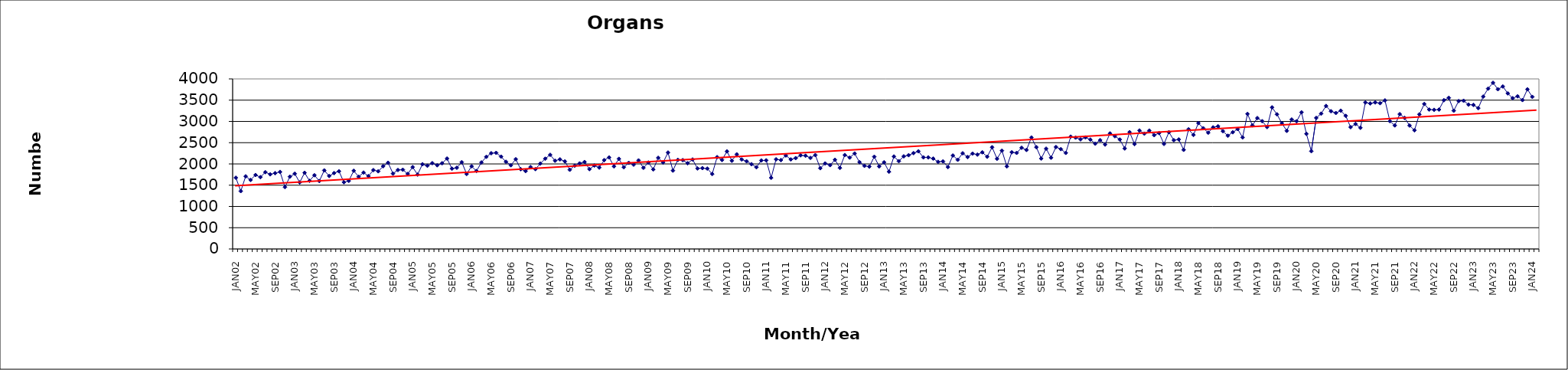
| Category | Series 0 |
|---|---|
| JAN02 | 1675 |
| FEB02 | 1360 |
| MAR02 | 1708 |
| APR02 | 1624 |
| MAY02 | 1740 |
| JUN02 | 1689 |
| JUL02 | 1806 |
| AUG02 | 1755 |
| SEP02 | 1783 |
| OCT02 | 1813 |
| NOV02 | 1455 |
| DEC02 | 1701 |
| JAN03 | 1770 |
| FEB03 | 1565 |
| MAR03 | 1792 |
| APR03 | 1603 |
| MAY03 | 1734 |
| JUN03 | 1598 |
| JUL03 | 1848 |
| AUG03 | 1716 |
| SEP03 | 1785 |
| OCT03 | 1827 |
| NOV03 | 1570 |
| DEC03 | 1602 |
| JAN04 | 1839 |
| FEB04 | 1700 |
| MAR04 | 1797 |
| APR04 | 1715 |
| MAY04 | 1855 |
| JUN04 | 1827 |
| JUL04 | 1946 |
| AUG04 | 2028 |
| SEP04 | 1773 |
| OCT04 | 1857 |
| NOV04 | 1864 |
| DEC04 | 1766 |
| JAN05 | 1925 |
| FEB05 | 1750 |
| MAR05 | 1993 |
| APR05 | 1958 |
| MAY05 | 2018 |
| JUN05 | 1969 |
| JUL05 | 2016 |
| AUG05 | 2127 |
| SEP05 | 1888 |
| OCT05 | 1910 |
| NOV05 | 2042 |
| DEC05 | 1764 |
| JAN06 | 1945 |
| FEB06 | 1834 |
| MAR06 | 2035 |
| APR06 | 2167 |
| MAY06 | 2252 |
| JUN06 | 2261 |
| JUL06 | 2172 |
| AUG06 | 2051 |
| SEP06 | 1969 |
| OCT06 | 2111 |
| NOV06 | 1876 |
| DEC06 | 1832 |
| JAN07 | 1927 |
| FEB07 | 1878 |
| MAR07 | 2009 |
| APR07 | 2122 |
| MAY07 | 2214 |
| JUN07 | 2076 |
| JUL07 | 2108 |
| AUG07 | 2060 |
| SEP07 | 1863 |
| OCT07 | 1959 |
| NOV07 | 2012 |
| DEC07 | 2046 |
| JAN08 | 1878 |
| FEB08 | 1962 |
| MAR08 | 1914 |
| APR08 | 2089 |
| MAY08 | 2153 |
| JUN08 | 1942 |
| JUL08 | 2120 |
| AUG08 | 1923 |
| SEP08 | 2026 |
| OCT08 | 1983 |
| NOV08 | 2083 |
| DEC08 | 1909 |
| JAN09 | 2033 |
| FEB09 | 1871 |
| MAR09 | 2144 |
| APR09 | 2033 |
| MAY09 | 2268 |
| JUN09 | 1844 |
| JUL09 | 2096 |
| AUG09 | 2089 |
| SEP09 | 2016 |
| OCT09 | 2104 |
| NOV09 | 1894 |
| DEC09 | 1901 |
| JAN10 | 1890 |
| FEB10 | 1763 |
| MAR10 | 2160 |
| APR10 | 2094 |
| MAY10 | 2295 |
| JUN10 | 2075 |
| JUL10 | 2226 |
| AUG10 | 2105 |
| SEP10 | 2062 |
| OCT10 | 1995 |
| NOV10 | 1922 |
| DEC10 | 2082 |
| JAN11 | 2085 |
| FEB11 | 1674 |
| MAR11 | 2109 |
| APR11 | 2091 |
| MAY11 | 2198 |
| JUN11 | 2106 |
| JUL11 | 2137 |
| AUG11 | 2202 |
| SEP11 | 2193 |
| OCT11 | 2143 |
| NOV11 | 2208 |
| DEC11 | 1899 |
| JAN12 | 2011 |
| FEB12 | 1971 |
| MAR12 | 2097 |
| APR12 | 1906 |
| MAY12 | 2210 |
| JUN12 | 2150 |
| JUL12 | 2245 |
| AUG12 | 2041 |
| SEP12 | 1955 |
| OCT12 | 1937 |
| NOV12 | 2170 |
| DEC12 | 1942 |
| JAN13 | 2039 |
| FEB13 | 1817 |
| MAR13 | 2175 |
| APR13 | 2065 |
| MAY13 | 2179 |
| JUN13 | 2205 |
| JUL13 | 2254 |
| AUG13 | 2297 |
| SEP13 | 2154 |
| OCT13 | 2154 |
| NOV13 | 2126 |
| DEC13 | 2049 |
| JAN14 | 2061 |
| FEB14 | 1927 |
| MAR14 | 2198 |
| APR14 | 2098 |
| MAY14 | 2251 |
| JUN14 | 2162 |
| JUL14 | 2243 |
| AUG14 | 2220 |
| SEP14 | 2273 |
| OCT14 | 2169 |
| NOV14 | 2392 |
| DEC14 | 2121 |
| JAN15 | 2312 |
| FEB15 | 1942 |
| MAR15 | 2275 |
| APR15 | 2260 |
| MAY15 | 2380 |
| JUN15 | 2329 |
| JUL15 | 2622 |
| AUG15 | 2394 |
| SEP15 | 2127 |
| OCT15 | 2359 |
| NOV15 | 2147 |
| DEC15 | 2398 |
| JAN16 | 2348 |
| FEB16 | 2259 |
| MAR16 | 2642 |
| APR16 | 2619 |
| MAY16 | 2578 |
| JUN16 | 2624 |
| JUL16 | 2573 |
| AUG16 | 2477 |
| SEP16 | 2560 |
| OCT16 | 2456 |
| NOV16 | 2717 |
| DEC16 | 2652 |
| JAN17 | 2574 |
| FEB17 | 2364 |
| MAR17 | 2747 |
| APR17 | 2466 |
| MAY17 | 2787 |
| JUN17 | 2713 |
| JUL17 | 2785 |
| AUG17 | 2676 |
| SEP17 | 2726 |
| OCT17 | 2470 |
| NOV17 | 2747 |
| DEC17 | 2558 |
| JAN18 | 2576 |
| FEB18 | 2331 |
| MAR18 | 2814 |
| APR18 | 2682 |
| MAY18 | 2960 |
| JUN18 | 2839 |
| JUL18 | 2735 |
| AUG18 | 2860 |
| SEP18 | 2886 |
| OCT18 | 2770 |
| NOV18 | 2663 |
| DEC18 | 2745 |
| JAN19 | 2820 |
| FEB19 | 2623 |
| MAR19 | 3176 |
| APR19 | 2907 |
| MAY19 | 3079 |
| JUN19 | 3005 |
| JUL19 | 2867 |
| AUG19 | 3330 |
| SEP19 | 3166 |
| OCT19 | 2958 |
| NOV19 | 2779 |
| DEC19 | 3045 |
| JAN20 | 3003 |
| FEB20 | 3214 |
| MAR20 | 2707 |
| APR20 | 2299 |
| MAY20 | 3082 |
| JUN20 | 3183 |
| JUL20 | 3364 |
| AUG20 | 3239 |
| SEP20 | 3199 |
| OCT20 | 3253 |
| NOV20 | 3131 |
| DEC20 | 2865 |
| JAN21 | 2940 |
| FEB21 | 2850 |
| MAR21 | 3445 |
| APR21 | 3422 |
| MAY21 | 3446 |
| JUN21 | 3429 |
| JUL21 | 3494 |
| AUG21 | 3006 |
| SEP21 | 2906 |
| OCT21 | 3171 |
| NOV21 | 3083 |
| DEC21 | 2903 |
| JAN22 | 2791 |
| FEB22 | 3166 |
| MAR22 | 3410 |
| APR22 | 3279 |
| MAY22 | 3273 |
| JUN22 | 3278 |
| JUL22 | 3499 |
| AUG22 | 3555 |
| SEP22 | 3252 |
| OCT22 | 3479 |
| NOV22 | 3487 |
| DEC22 | 3395 |
| JAN23 | 3388 |
| FEB23 | 3313 |
| MAR23 | 3584 |
| APR23 | 3772 |
| MAY23 | 3909 |
| JUN23 | 3757 |
| JUL23 | 3822 |
| AUG23 | 3659 |
| SEP23 | 3546 |
| OCT23 | 3590 |
| NOV23 | 3502 |
| DEC23 | 3754 |
| JAN24 | 3578 |